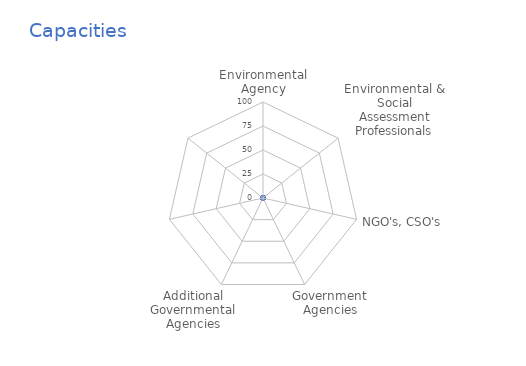
| Category | Series 0 |
|---|---|
| Environmental Agency | 0 |
| Environmental & Social Assessment Professionals | 0 |
| NGO's, CSO's | 0 |
| Government Agencies | 0 |
| Additional Governmental Agencies | 0 |